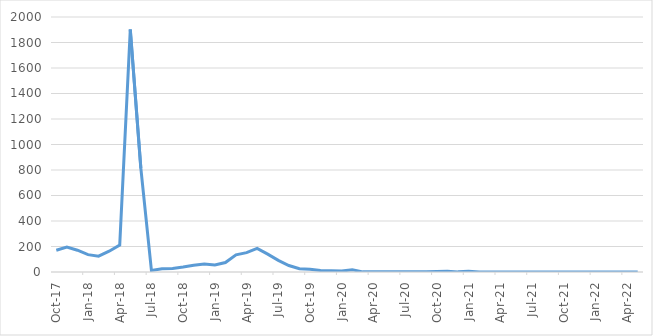
| Category | Frequency |
|---|---|
| 2017-10-01 | 171 |
| 2017-11-01 | 196 |
| 2017-12-01 | 171 |
| 2018-01-01 | 136 |
| 2018-02-01 | 124 |
| 2018-03-01 | 163 |
| 2018-04-01 | 211 |
| 2018-05-01 | 1902 |
| 2018-06-01 | 812 |
| 2018-07-01 | 12 |
| 2018-08-01 | 26 |
| 2018-09-01 | 27 |
| 2018-10-01 | 39 |
| 2018-11-01 | 53 |
| 2018-12-01 | 62 |
| 2019-01-01 | 55 |
| 2019-02-01 | 74 |
| 2019-03-01 | 135 |
| 2019-04-01 | 152 |
| 2019-05-01 | 185 |
| 2019-06-01 | 140 |
| 2019-07-01 | 91 |
| 2019-08-01 | 51 |
| 2019-09-01 | 26 |
| 2019-10-01 | 21 |
| 2019-11-01 | 12 |
| 2019-12-01 | 10 |
| 2020-01-01 | 7 |
| 2020-02-01 | 18 |
| 2020-03-01 | 1 |
| 2020-04-01 | 2 |
| 2020-05-01 | 2 |
| 2020-09-01 | 2 |
| 2020-11-01 | 6 |
| 2020-12-01 | 1 |
| 2021-01-01 | 5 |
| 2021-02-01 | 0 |
| 2021-03-01 | 0 |
| 2021-04-01 | 0 |
| 2021-05-01 | 0 |
| 2021-06-01 | 0 |
| 2021-07-01 | 0 |
| 2021-08-01 | 0 |
| 2021-09-01 | 0 |
| 2021-10-01 | 0 |
| 2021-11-01 | 0 |
| 2021-12-01 | 0 |
| 2022-01-01 | 0 |
| 2022-02-01 | 0 |
| 2022-03-01 | 0 |
| 2022-04-01 | 0 |
| 2022-05-01 | 0 |